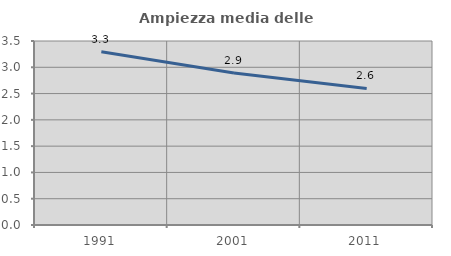
| Category | Ampiezza media delle famiglie |
|---|---|
| 1991.0 | 3.294 |
| 2001.0 | 2.889 |
| 2011.0 | 2.596 |